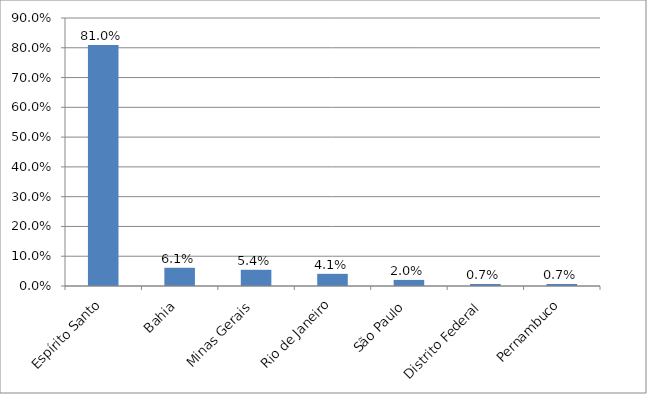
| Category | Series 0 |
|---|---|
| Espírito Santo | 0.81 |
| Bahia | 0.061 |
| Minas Gerais | 0.054 |
| Rio de Janeiro | 0.041 |
| São Paulo | 0.02 |
| Distrito Federal | 0.007 |
| Pernambuco | 0.007 |